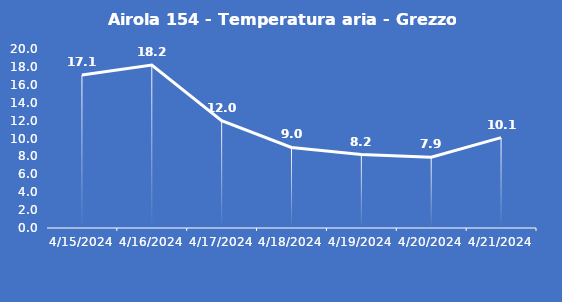
| Category | Airola 154 - Temperatura aria - Grezzo (°C) |
|---|---|
| 4/15/24 | 17.1 |
| 4/16/24 | 18.2 |
| 4/17/24 | 12 |
| 4/18/24 | 9 |
| 4/19/24 | 8.2 |
| 4/20/24 | 7.9 |
| 4/21/24 | 10.1 |